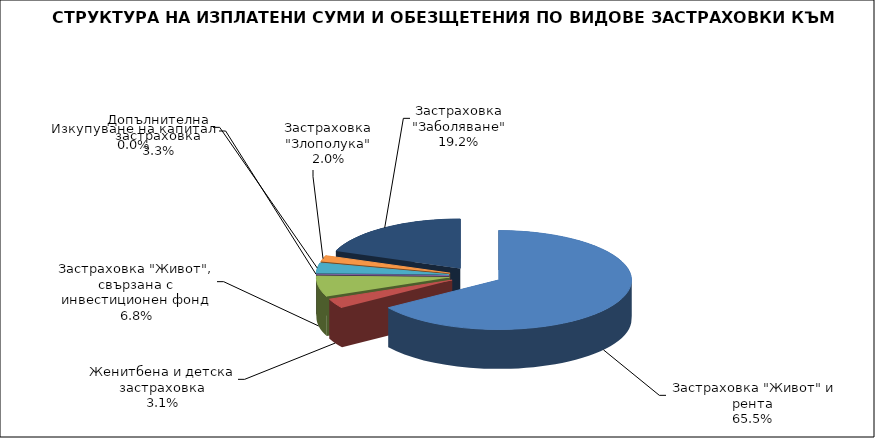
| Category | Series 0 |
|---|---|
|  Застраховка "Живот" и рента | 50431492.965 |
| Женитбена и детска застраховка | 2421582.09 |
| Застраховка "Живот", свързана с инвестиционен фонд | 5208732.476 |
| Изкупуване на капитал | 0 |
| Допълнителна застраховка | 2564598.325 |
| Застраховка "Злополука" | 1532805.98 |
| Застраховка "Заболяване" | 14810406.022 |